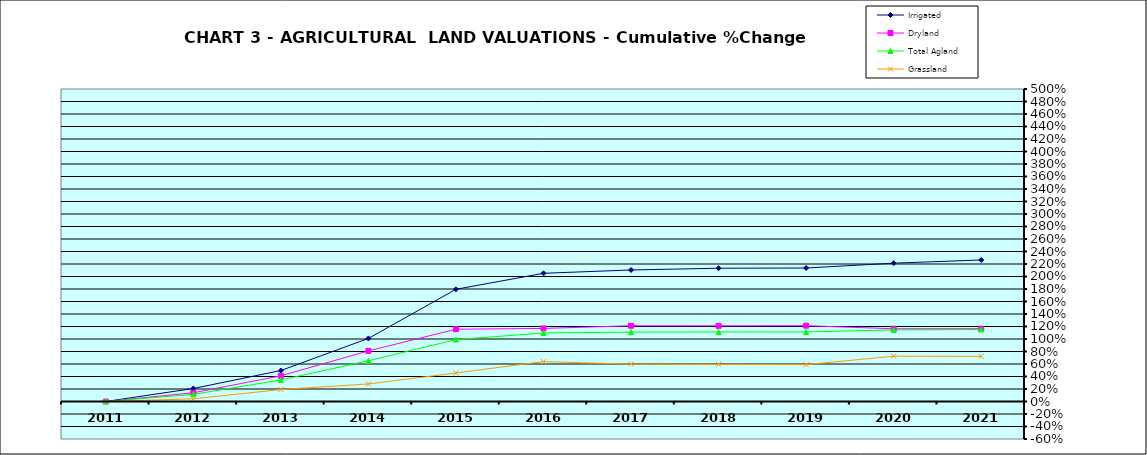
| Category | Irrigated | Dryland | Total Agland | Grassland |
|---|---|---|---|---|
| 2011.0 | 0 | 0 | 0 | 0 |
| 2012.0 | 0.208 | 0.14 | 0.115 | 0.043 |
| 2013.0 | 0.496 | 0.411 | 0.345 | 0.192 |
| 2014.0 | 1.009 | 0.81 | 0.651 | 0.281 |
| 2015.0 | 1.795 | 1.157 | 0.991 | 0.456 |
| 2016.0 | 2.051 | 1.169 | 1.096 | 0.639 |
| 2017.0 | 2.104 | 1.212 | 1.111 | 0.597 |
| 2018.0 | 2.132 | 1.211 | 1.113 | 0.594 |
| 2019.0 | 2.136 | 1.213 | 1.113 | 0.59 |
| 2020.0 | 2.213 | 1.164 | 1.145 | 0.725 |
| 2021.0 | 2.265 | 1.165 | 1.152 | 0.721 |